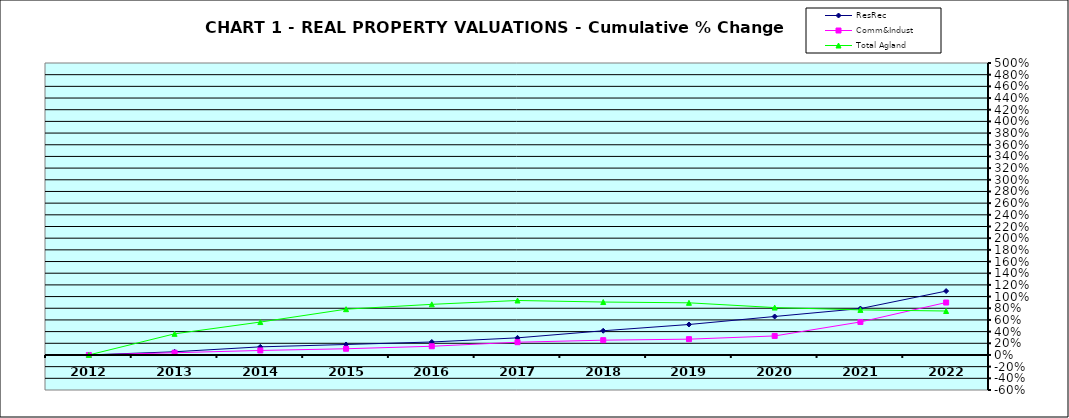
| Category | ResRec | Comm&Indust | Total Agland |
|---|---|---|---|
| 2012.0 | 0 | 0 | 0 |
| 2013.0 | 0.055 | 0.038 | 0.362 |
| 2014.0 | 0.139 | 0.077 | 0.564 |
| 2015.0 | 0.179 | 0.106 | 0.784 |
| 2016.0 | 0.222 | 0.149 | 0.867 |
| 2017.0 | 0.293 | 0.218 | 0.933 |
| 2018.0 | 0.414 | 0.253 | 0.906 |
| 2019.0 | 0.522 | 0.271 | 0.893 |
| 2020.0 | 0.659 | 0.326 | 0.812 |
| 2021.0 | 0.794 | 0.566 | 0.772 |
| 2022.0 | 1.094 | 0.898 | 0.753 |